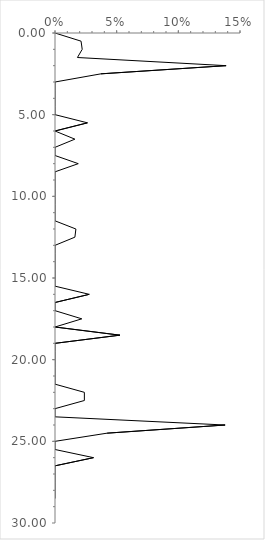
| Category | Series 0 |
|---|---|
| 0.0 | 0 |
| 0.02112676056338028 | 0.5 |
| 0.022058823529411766 | 1 |
| 0.01818181818181818 | 1.5 |
| 0.13872832369942195 | 2 |
| 0.037267080745341616 | 2.5 |
| 0.0 | 3 |
| 0.0 | 3.5 |
| 0.0 | 4 |
| 0.0 | 4.5 |
| 0.0 | 5 |
| 0.02631578947368421 | 5.5 |
| 0.0 | 6 |
| 0.016129032258064516 | 6.5 |
| 0.0 | 7 |
| 0.0 | 7.5 |
| 0.018867924528301886 | 8 |
| 0.0 | 8.5 |
| 0.0 | 9 |
| 0.0 | 9.5 |
| 0.0 | 10 |
| 0.0 | 10.5 |
| 0.0 | 11 |
| 0.0 | 11.5 |
| 0.01694915254237288 | 12 |
| 0.016129032258064516 | 12.5 |
| 0.0 | 13 |
| 0.0 | 13.5 |
| 0.0 | 14 |
| 0.0 | 14.5 |
| 0.0 | 15 |
| 0.0 | 15.5 |
| 0.027777777777777776 | 16 |
| 0.0 | 16.5 |
| 0.0 | 17 |
| 0.021739130434782608 | 17.5 |
| 0.0 | 18 |
| 0.05263157894736842 | 18.5 |
| 0.0 | 19 |
| 0.0 | 19.5 |
| 0.0 | 20 |
| 0.0 | 20.5 |
| 0.0 | 21 |
| 0.0 | 21.5 |
| 0.023809523809523808 | 22 |
| 0.023809523809523808 | 22.5 |
| 0.0 | 23 |
| 0.0 | 23.5 |
| 0.13793103448275862 | 24 |
| 0.04225352112676056 | 24.5 |
| 0.0 | 25 |
| 0.0 | 25.5 |
| 0.03125 | 26 |
| 0.0 | 26.5 |
| 0.0 | 27 |
| 0.0 | 27.5 |
| 0.0 | 28 |
| 0.0 | 28.5 |